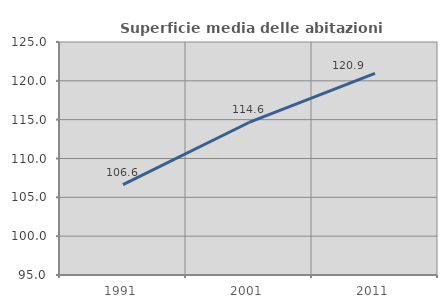
| Category | Superficie media delle abitazioni occupate |
|---|---|
| 1991.0 | 106.642 |
| 2001.0 | 114.639 |
| 2011.0 | 120.95 |